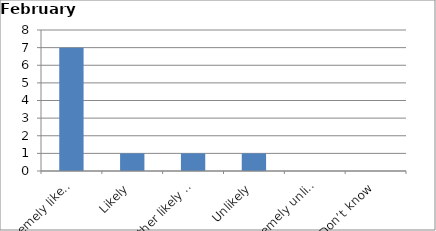
| Category | Series 0 |
|---|---|
| Extremely likely | 7 |
| Likely | 1 |
| Neither likely nor unlikely | 1 |
| Unlikely | 1 |
| Extremely unlikely | 0 |
| Don’t know | 0 |